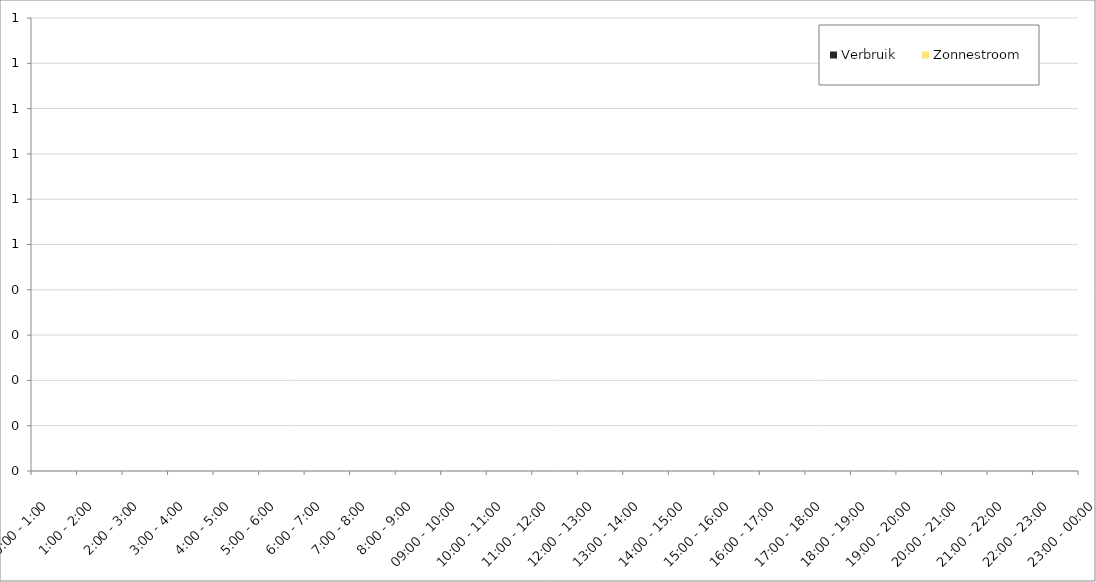
| Category | Verbruik | Zonnestroom |
|---|---|---|
| 0:00 - 1:00 | 0 | 0 |
| 1:00 - 2:00 | 0 | 0 |
| 2:00 - 3:00 | 0 | 0 |
| 3:00 - 4:00 | 0 | 0 |
| 4:00 - 5:00 | 0 | 0 |
| 5:00 - 6:00 | 0 | 0 |
| 6:00 - 7:00 | 0 | 0 |
| 7:00 - 8:00 | 0 | 0 |
| 8:00 - 9:00 | 0 | 0 |
| 09:00 - 10:00 | 0 | 0 |
| 10:00 - 11:00 | 0 | 0 |
| 11:00 - 12:00 | 0 | 0 |
| 12:00 - 13:00 | 0 | 0 |
| 13:00 - 14:00 | 0 | 0 |
| 14:00 - 15:00 | 0 | 0 |
| 15:00 - 16:00 | 0 | 0 |
| 16:00 - 17:00 | 0 | 0 |
| 17:00 - 18:00 | 0 | 0 |
| 18:00 - 19:00 | 0 | 0 |
| 19:00 - 20:00 | 0 | 0 |
| 20:00 - 21:00 | 0 | 0 |
| 21:00 - 22:00 | 0 | 0 |
| 22:00 - 23:00 | 0 | 0 |
| 23:00 - 00:00 | 0 | 0 |